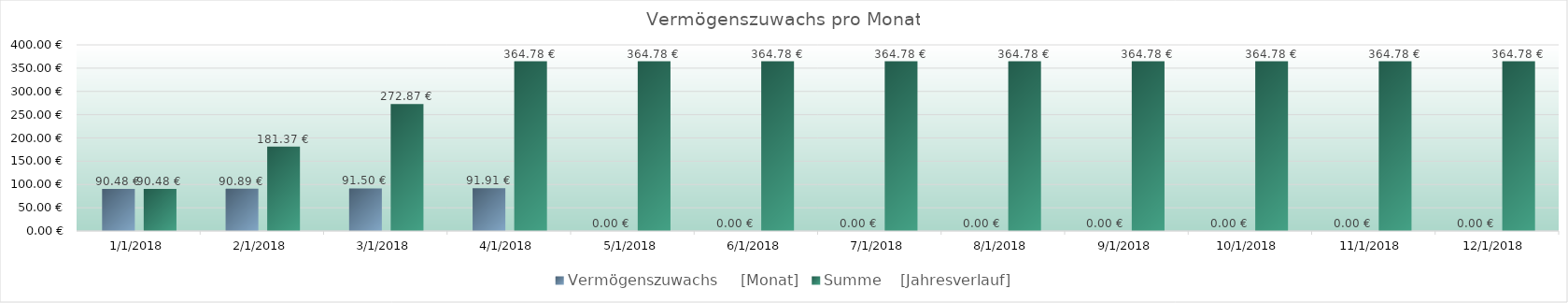
| Category | Vermögenszuwachs     [Monat] | Summe    [Jahresverlauf] |
|---|---|---|
| 1/1/18 | 90.48 | 90.48 |
| 2/1/18 | 90.89 | 181.37 |
| 3/1/18 | 91.5 | 272.87 |
| 4/1/18 | 91.91 | 364.78 |
| 5/1/18 | 0 | 364.78 |
| 6/1/18 | 0 | 364.78 |
| 7/1/18 | 0 | 364.78 |
| 8/1/18 | 0 | 364.78 |
| 9/1/18 | 0 | 364.78 |
| 10/1/18 | 0 | 364.78 |
| 11/1/18 | 0 | 364.78 |
| 12/1/18 | 0 | 364.78 |